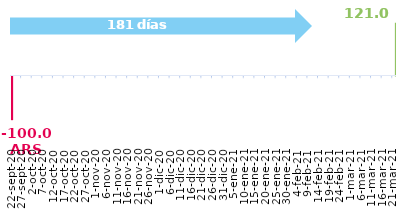
| Category | Series 0 |
|---|---|
| 2020-09-22 | -100 |
| 2021-03-22 | 120.992 |